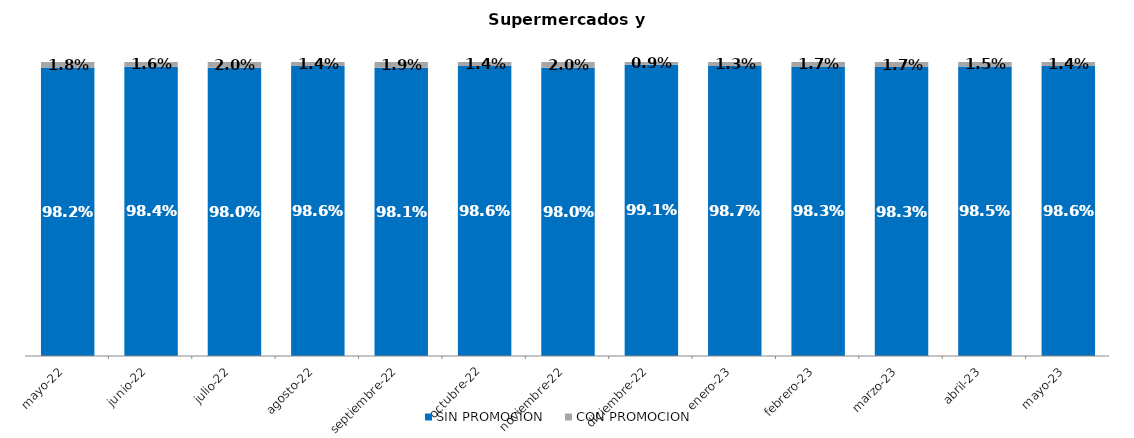
| Category | SIN PROMOCION   | CON PROMOCION   |
|---|---|---|
| 2022-05-01 | 0.982 | 0.018 |
| 2022-06-01 | 0.984 | 0.016 |
| 2022-07-01 | 0.98 | 0.02 |
| 2022-08-01 | 0.986 | 0.014 |
| 2022-09-01 | 0.981 | 0.019 |
| 2022-10-01 | 0.986 | 0.014 |
| 2022-11-01 | 0.98 | 0.02 |
| 2022-12-01 | 0.991 | 0.009 |
| 2023-01-01 | 0.987 | 0.013 |
| 2023-02-01 | 0.983 | 0.017 |
| 2023-03-01 | 0.983 | 0.017 |
| 2023-04-01 | 0.985 | 0.015 |
| 2023-05-01 | 0.986 | 0.014 |